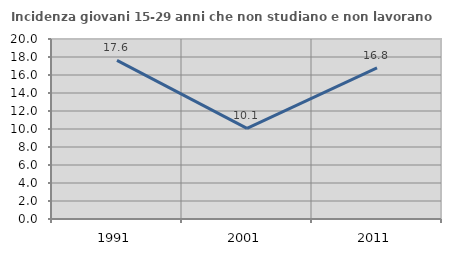
| Category | Incidenza giovani 15-29 anni che non studiano e non lavorano  |
|---|---|
| 1991.0 | 17.627 |
| 2001.0 | 10.076 |
| 2011.0 | 16.782 |